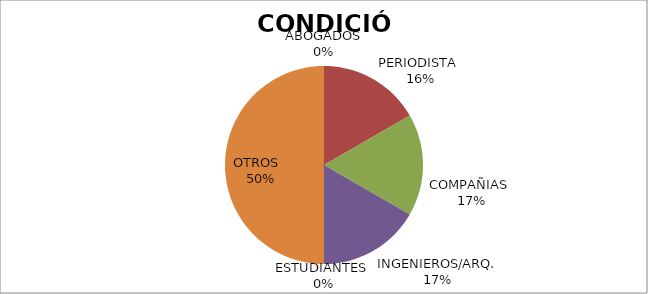
| Category | Series 0 |
|---|---|
| ABOGADOS | 0 |
| PERIODISTA  | 1 |
| COMPAÑIAS  | 1 |
| INGENIEROS/ARQ. | 1 |
| ESTUDIANTES  | 0 |
| OTROS   | 3 |